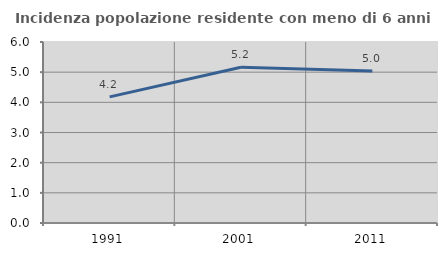
| Category | Incidenza popolazione residente con meno di 6 anni |
|---|---|
| 1991.0 | 4.182 |
| 2001.0 | 5.16 |
| 2011.0 | 5.039 |